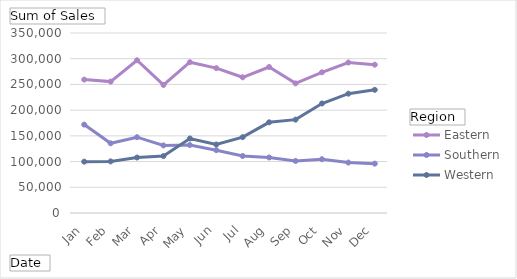
| Category | Eastern | Southern | Western |
|---|---|---|---|
| Jan | 259416 | 171897 | 99833 |
| Feb | 255487 | 135497 | 100333 |
| Mar | 296958 | 147425 | 107884 |
| Apr | 248956 | 131401 | 110628 |
| May | 293192 | 132165 | 144889 |
| Jun | 281641 | 122156 | 133153 |
| Jul | 263899 | 110844 | 147484 |
| Aug | 283917 | 107935 | 176325 |
| Sep | 252049 | 101233 | 181518 |
| Oct | 273592 | 104542 | 212932 |
| Nov | 292585 | 98041 | 232032 |
| Dec | 288378 | 95986 | 239514 |